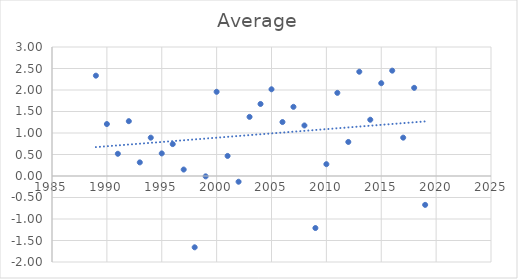
| Category | Average |
|---|---|
| 1989.0 | 2.333 |
| 1990.0 | 1.208 |
| 1991.0 | 0.517 |
| 1992.0 | 1.275 |
| 1993.0 | 0.317 |
| 1994.0 | 0.892 |
| 1995.0 | 0.525 |
| 1996.0 | 0.742 |
| 1997.0 | 0.15 |
| 1998.0 | -1.658 |
| 1999.0 | -0.008 |
| 2000.0 | 1.958 |
| 2001.0 | 0.467 |
| 2002.0 | -0.133 |
| 2003.0 | 1.375 |
| 2004.0 | 1.675 |
| 2005.0 | 2.017 |
| 2006.0 | 1.255 |
| 2007.0 | 1.608 |
| 2008.0 | 1.175 |
| 2009.0 | -1.21 |
| 2010.0 | 0.275 |
| 2011.0 | 1.933 |
| 2012.0 | 0.792 |
| 2013.0 | 2.425 |
| 2014.0 | 1.308 |
| 2015.0 | 2.158 |
| 2016.0 | 2.45 |
| 2017.0 | 0.892 |
| 2018.0 | 2.05 |
| 2019.0 | -0.671 |